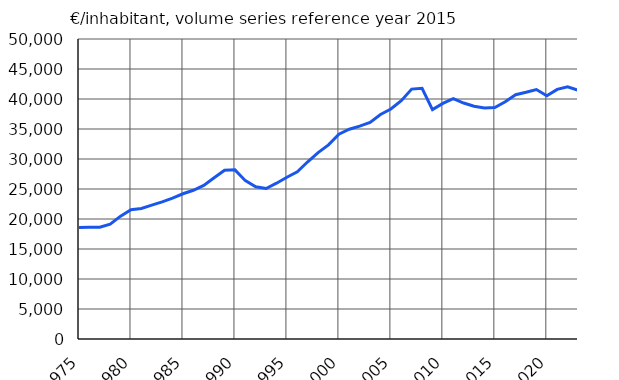
| Category | €/inhabitant, volume series reference year 2015 |
|---|---|
| 1975 | 18576 |
| 1976 | 18613 |
| 1977 | 18621 |
| 1978 | 19152 |
| 1979 | 20475 |
| 1980 | 21561 |
| 1981 | 21751 |
| 1982 | 22302 |
| 1983 | 22860 |
| 1984 | 23475 |
| 1985 | 24207 |
| 1986 | 24793 |
| 1987 | 25607 |
| 1988 | 26864 |
| 1989 | 28129 |
| 1990 | 28193 |
| 1991 | 26389 |
| 1992 | 25376 |
| 1993 | 25087 |
| 1994 | 25969 |
| 1995 | 26961 |
| 1996 | 27858 |
| 1997 | 29535 |
| 1998 | 31064 |
| 1999 | 32349 |
| 2000 | 34145 |
| 2001 | 34957 |
| 2002 | 35468 |
| 2003 | 36092 |
| 2004 | 37424 |
| 2005 | 38333 |
| 2006 | 39724 |
| 2007 | 41652 |
| 2008 | 41783 |
| 2009 | 38226 |
| 2010 | 39263 |
| 2011 | 40078 |
| 2012 | 39330 |
| 2013 | 38796 |
| 2014 | 38488 |
| 2015 | 38570 |
| 2016 | 39548 |
| 2017 | 40715 |
| 2018 | 41119 |
| 2019 | 41582 |
| 2020 | 40536 |
| 2021 | 41605 |
| 2022* | 42044 |
| 2023* | 41456 |